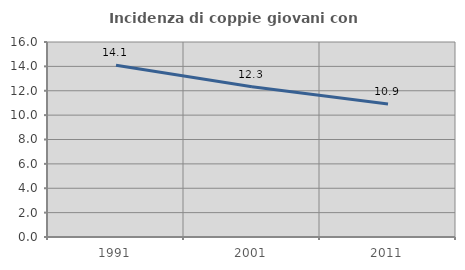
| Category | Incidenza di coppie giovani con figli |
|---|---|
| 1991.0 | 14.092 |
| 2001.0 | 12.322 |
| 2011.0 | 10.908 |